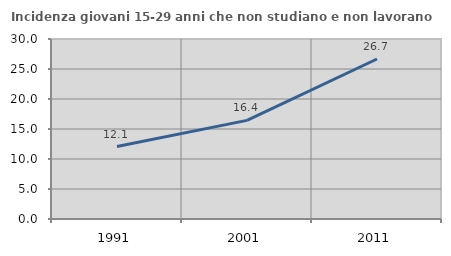
| Category | Incidenza giovani 15-29 anni che non studiano e non lavorano  |
|---|---|
| 1991.0 | 12.069 |
| 2001.0 | 16.438 |
| 2011.0 | 26.667 |